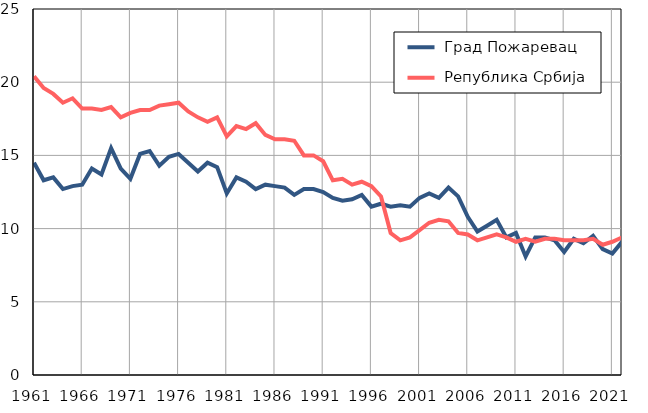
| Category |  Град Пожаревац |  Република Србија |
|---|---|---|
| 1961.0 | 14.5 | 20.4 |
| 1962.0 | 13.3 | 19.6 |
| 1963.0 | 13.5 | 19.2 |
| 1964.0 | 12.7 | 18.6 |
| 1965.0 | 12.9 | 18.9 |
| 1966.0 | 13 | 18.2 |
| 1967.0 | 14.1 | 18.2 |
| 1968.0 | 13.7 | 18.1 |
| 1969.0 | 15.5 | 18.3 |
| 1970.0 | 14.1 | 17.6 |
| 1971.0 | 13.4 | 17.9 |
| 1972.0 | 15.1 | 18.1 |
| 1973.0 | 15.3 | 18.1 |
| 1974.0 | 14.3 | 18.4 |
| 1975.0 | 14.9 | 18.5 |
| 1976.0 | 15.1 | 18.6 |
| 1977.0 | 14.5 | 18 |
| 1978.0 | 13.9 | 17.6 |
| 1979.0 | 14.5 | 17.3 |
| 1980.0 | 14.2 | 17.6 |
| 1981.0 | 12.4 | 16.3 |
| 1982.0 | 13.5 | 17 |
| 1983.0 | 13.2 | 16.8 |
| 1984.0 | 12.7 | 17.2 |
| 1985.0 | 13 | 16.4 |
| 1986.0 | 12.9 | 16.1 |
| 1987.0 | 12.8 | 16.1 |
| 1988.0 | 12.3 | 16 |
| 1989.0 | 12.7 | 15 |
| 1990.0 | 12.7 | 15 |
| 1991.0 | 12.5 | 14.6 |
| 1992.0 | 12.1 | 13.3 |
| 1993.0 | 11.9 | 13.4 |
| 1994.0 | 12 | 13 |
| 1995.0 | 12.3 | 13.2 |
| 1996.0 | 11.5 | 12.9 |
| 1997.0 | 11.7 | 12.2 |
| 1998.0 | 11.5 | 9.7 |
| 1999.0 | 11.6 | 9.2 |
| 2000.0 | 11.5 | 9.4 |
| 2001.0 | 12.1 | 9.9 |
| 2002.0 | 12.4 | 10.4 |
| 2003.0 | 12.1 | 10.6 |
| 2004.0 | 12.8 | 10.5 |
| 2005.0 | 12.2 | 9.7 |
| 2006.0 | 10.8 | 9.6 |
| 2007.0 | 9.8 | 9.2 |
| 2008.0 | 10.2 | 9.4 |
| 2009.0 | 10.6 | 9.6 |
| 2010.0 | 9.4 | 9.4 |
| 2011.0 | 9.7 | 9.1 |
| 2012.0 | 8.1 | 9.3 |
| 2013.0 | 9.4 | 9.1 |
| 2014.0 | 9.4 | 9.3 |
| 2015.0 | 9.2 | 9.3 |
| 2016.0 | 8.4 | 9.2 |
| 2017.0 | 9.3 | 9.2 |
| 2018.0 | 9 | 9.2 |
| 2019.0 | 9.5 | 9.3 |
| 2020.0 | 8.6 | 8.9 |
| 2021.0 | 8.3 | 9.1 |
| 2022.0 | 9.1 | 9.4 |